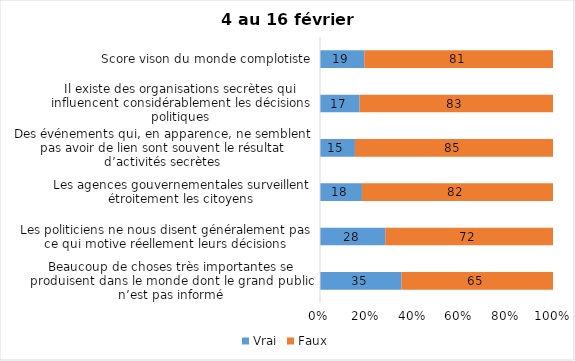
| Category | Vrai | Faux |
|---|---|---|
| Beaucoup de choses très importantes se produisent dans le monde dont le grand public n’est pas informé | 35 | 65 |
| Les politiciens ne nous disent généralement pas ce qui motive réellement leurs décisions | 28 | 72 |
| Les agences gouvernementales surveillent étroitement les citoyens | 18 | 82 |
| Des événements qui, en apparence, ne semblent pas avoir de lien sont souvent le résultat d’activités secrètes | 15 | 85 |
| Il existe des organisations secrètes qui influencent considérablement les décisions politiques | 17 | 83 |
| Score vison du monde complotiste | 19 | 81 |